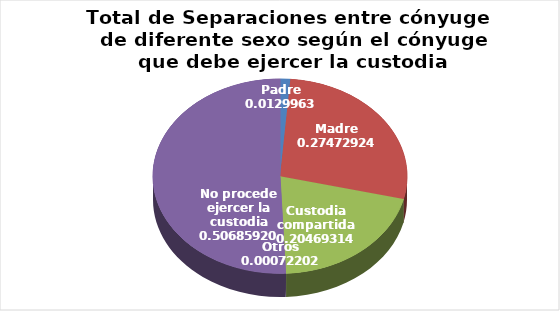
| Category | Series 0 |
|---|---|
| Padre | 36 |
| Madre | 761 |
| Custodia compartida | 567 |
| Otros | 2 |
| No procede ejercer la custodia | 1404 |